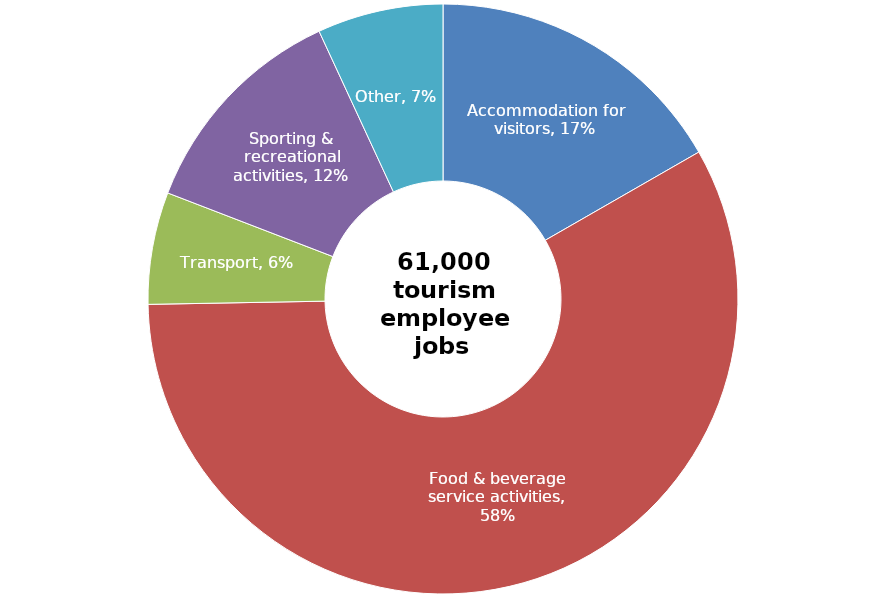
| Category | Series 0 |
|---|---|
| Accommodation for visitors | 0.167 |
| Food & beverage service activities | 0.58 |
| Transport | 0.061 |
| Sporting & recreational activities | 0.122 |
| Other | 0.069 |